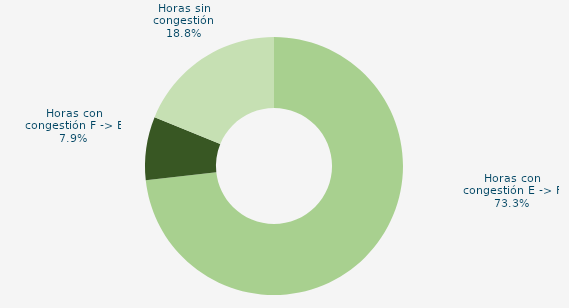
| Category | Horas con congestión E -> F |
|---|---|
| Horas con congestión E -> F | 73.253 |
| Horas con congestión F -> E | 7.93 |
| Horas sin congestión | 18.817 |